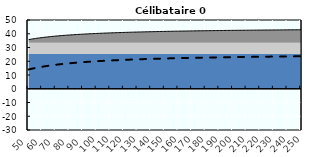
| Category | Coin fiscal moyen (somme des composantes) | Taux moyen d'imposition net en % du salaire brut |
|---|---|---|
| 50.0 | 35.746 | 14.028 |
| 51.0 | 35.922 | 14.263 |
| 52.0 | 36.09 | 14.489 |
| 53.0 | 36.253 | 14.706 |
| 54.0 | 36.409 | 14.915 |
| 55.0 | 36.56 | 15.117 |
| 56.0 | 36.705 | 15.311 |
| 57.0 | 36.845 | 15.499 |
| 58.0 | 36.98 | 15.68 |
| 59.0 | 37.111 | 15.855 |
| 60.0 | 37.237 | 16.024 |
| 61.0 | 37.36 | 16.187 |
| 62.0 | 37.478 | 16.345 |
| 63.0 | 37.592 | 16.499 |
| 64.0 | 37.703 | 16.647 |
| 65.0 | 37.811 | 16.791 |
| 66.0 | 37.915 | 16.931 |
| 67.0 | 38.016 | 17.066 |
| 68.0 | 38.115 | 17.197 |
| 69.0 | 38.21 | 17.325 |
| 70.0 | 38.303 | 17.449 |
| 71.0 | 38.393 | 17.569 |
| 72.0 | 38.48 | 17.686 |
| 73.0 | 38.565 | 17.8 |
| 74.0 | 38.648 | 17.911 |
| 75.0 | 38.729 | 18.019 |
| 76.0 | 38.807 | 18.124 |
| 77.0 | 38.884 | 18.226 |
| 78.0 | 38.958 | 18.326 |
| 79.0 | 39.031 | 18.423 |
| 80.0 | 39.101 | 18.518 |
| 81.0 | 39.17 | 18.61 |
| 82.0 | 39.238 | 18.7 |
| 83.0 | 39.304 | 18.788 |
| 84.0 | 39.368 | 18.874 |
| 85.0 | 39.43 | 18.958 |
| 86.0 | 39.492 | 19.04 |
| 87.0 | 39.551 | 19.12 |
| 88.0 | 39.61 | 19.198 |
| 89.0 | 39.667 | 19.274 |
| 90.0 | 39.723 | 19.349 |
| 91.0 | 39.777 | 19.422 |
| 92.0 | 39.831 | 19.494 |
| 93.0 | 39.883 | 19.564 |
| 94.0 | 39.934 | 19.632 |
| 95.0 | 39.984 | 19.699 |
| 96.0 | 40.033 | 19.765 |
| 97.0 | 40.082 | 19.829 |
| 98.0 | 40.129 | 19.892 |
| 99.0 | 40.175 | 19.954 |
| 100.0 | 40.22 | 20.014 |
| 101.0 | 40.264 | 20.073 |
| 102.0 | 40.308 | 20.132 |
| 103.0 | 40.35 | 20.189 |
| 104.0 | 40.392 | 20.244 |
| 105.0 | 40.433 | 20.299 |
| 106.0 | 40.473 | 20.353 |
| 107.0 | 40.513 | 20.406 |
| 108.0 | 40.551 | 20.458 |
| 109.0 | 40.589 | 20.508 |
| 110.0 | 40.627 | 20.558 |
| 111.0 | 40.663 | 20.607 |
| 112.0 | 40.699 | 20.656 |
| 113.0 | 40.735 | 20.703 |
| 114.0 | 40.769 | 20.749 |
| 115.0 | 40.803 | 20.795 |
| 116.0 | 40.837 | 20.84 |
| 117.0 | 40.87 | 20.884 |
| 118.0 | 40.902 | 20.927 |
| 119.0 | 40.934 | 20.97 |
| 120.0 | 40.965 | 21.012 |
| 121.0 | 40.996 | 21.053 |
| 122.0 | 41.027 | 21.094 |
| 123.0 | 41.056 | 21.133 |
| 124.0 | 41.086 | 21.173 |
| 125.0 | 41.115 | 21.211 |
| 126.0 | 41.143 | 21.249 |
| 127.0 | 41.171 | 21.287 |
| 128.0 | 41.198 | 21.324 |
| 129.0 | 41.226 | 21.36 |
| 130.0 | 41.252 | 21.396 |
| 131.0 | 41.279 | 21.431 |
| 132.0 | 41.304 | 21.465 |
| 133.0 | 41.33 | 21.499 |
| 134.0 | 41.355 | 21.533 |
| 135.0 | 41.38 | 21.566 |
| 136.0 | 41.404 | 21.599 |
| 137.0 | 41.428 | 21.631 |
| 138.0 | 41.452 | 21.662 |
| 139.0 | 41.475 | 21.694 |
| 140.0 | 41.498 | 21.724 |
| 141.0 | 41.521 | 21.755 |
| 142.0 | 41.543 | 21.785 |
| 143.0 | 41.565 | 21.814 |
| 144.0 | 41.587 | 21.843 |
| 145.0 | 41.608 | 21.872 |
| 146.0 | 41.629 | 21.9 |
| 147.0 | 41.65 | 21.928 |
| 148.0 | 41.671 | 21.956 |
| 149.0 | 41.691 | 21.983 |
| 150.0 | 41.711 | 22.009 |
| 151.0 | 41.731 | 22.036 |
| 152.0 | 41.75 | 22.062 |
| 153.0 | 41.77 | 22.088 |
| 154.0 | 41.789 | 22.113 |
| 155.0 | 41.807 | 22.138 |
| 156.0 | 41.826 | 22.163 |
| 157.0 | 41.844 | 22.187 |
| 158.0 | 41.862 | 22.212 |
| 159.0 | 41.88 | 22.235 |
| 160.0 | 41.898 | 22.259 |
| 161.0 | 41.915 | 22.282 |
| 162.0 | 41.932 | 22.305 |
| 163.0 | 41.949 | 22.328 |
| 164.0 | 41.966 | 22.35 |
| 165.0 | 41.982 | 22.372 |
| 166.0 | 41.999 | 22.394 |
| 167.0 | 42.015 | 22.416 |
| 168.0 | 42.031 | 22.437 |
| 169.0 | 42.046 | 22.458 |
| 170.0 | 42.062 | 22.479 |
| 171.0 | 42.077 | 22.5 |
| 172.0 | 42.093 | 22.52 |
| 173.0 | 42.108 | 22.54 |
| 174.0 | 42.122 | 22.56 |
| 175.0 | 42.137 | 22.58 |
| 176.0 | 42.152 | 22.599 |
| 177.0 | 42.166 | 22.618 |
| 178.0 | 42.18 | 22.637 |
| 179.0 | 42.194 | 22.656 |
| 180.0 | 42.208 | 22.675 |
| 181.0 | 42.222 | 22.693 |
| 182.0 | 42.235 | 22.711 |
| 183.0 | 42.249 | 22.729 |
| 184.0 | 42.262 | 22.747 |
| 185.0 | 42.275 | 22.764 |
| 186.0 | 42.288 | 22.782 |
| 187.0 | 42.301 | 22.799 |
| 188.0 | 42.314 | 22.816 |
| 189.0 | 42.327 | 22.833 |
| 190.0 | 42.339 | 22.85 |
| 191.0 | 42.351 | 22.866 |
| 192.0 | 42.364 | 22.882 |
| 193.0 | 42.376 | 22.899 |
| 194.0 | 42.388 | 22.915 |
| 195.0 | 42.399 | 22.93 |
| 196.0 | 42.411 | 22.946 |
| 197.0 | 42.423 | 22.962 |
| 198.0 | 42.434 | 22.977 |
| 199.0 | 42.445 | 22.992 |
| 200.0 | 42.457 | 23.007 |
| 201.0 | 42.468 | 23.022 |
| 202.0 | 42.479 | 23.037 |
| 203.0 | 42.49 | 23.051 |
| 204.0 | 42.501 | 23.066 |
| 205.0 | 42.511 | 23.08 |
| 206.0 | 42.522 | 23.094 |
| 207.0 | 42.532 | 23.108 |
| 208.0 | 42.543 | 23.122 |
| 209.0 | 42.553 | 23.136 |
| 210.0 | 42.563 | 23.15 |
| 211.0 | 42.573 | 23.163 |
| 212.0 | 42.583 | 23.177 |
| 213.0 | 42.593 | 23.19 |
| 214.0 | 42.603 | 23.203 |
| 215.0 | 42.613 | 23.216 |
| 216.0 | 42.622 | 23.229 |
| 217.0 | 42.632 | 23.242 |
| 218.0 | 42.641 | 23.254 |
| 219.0 | 42.651 | 23.267 |
| 220.0 | 42.66 | 23.279 |
| 221.0 | 42.669 | 23.291 |
| 222.0 | 42.678 | 23.304 |
| 223.0 | 42.687 | 23.316 |
| 224.0 | 42.696 | 23.328 |
| 225.0 | 42.705 | 23.34 |
| 226.0 | 42.714 | 23.351 |
| 227.0 | 42.723 | 23.363 |
| 228.0 | 42.731 | 23.375 |
| 229.0 | 42.74 | 23.386 |
| 230.0 | 42.748 | 23.397 |
| 231.0 | 42.757 | 23.409 |
| 232.0 | 42.765 | 23.42 |
| 233.0 | 42.774 | 23.431 |
| 234.0 | 42.782 | 23.442 |
| 235.0 | 42.79 | 23.453 |
| 236.0 | 42.798 | 23.464 |
| 237.0 | 42.806 | 23.474 |
| 238.0 | 42.814 | 23.485 |
| 239.0 | 42.822 | 23.495 |
| 240.0 | 42.83 | 23.506 |
| 241.0 | 42.837 | 23.516 |
| 242.0 | 42.845 | 23.527 |
| 243.0 | 42.853 | 23.537 |
| 244.0 | 42.86 | 23.547 |
| 245.0 | 42.868 | 23.557 |
| 246.0 | 42.875 | 23.567 |
| 247.0 | 42.882 | 23.577 |
| 248.0 | 42.89 | 23.586 |
| 249.0 | 42.897 | 23.596 |
| 250.0 | 42.904 | 23.606 |